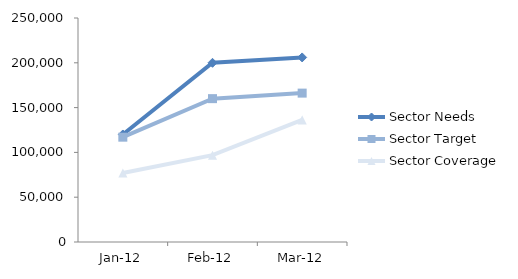
| Category | Sector |
|---|---|
| 2012-01-01 | 77000 |
| 2012-02-01 | 96900 |
| 2012-03-01 | 136244 |